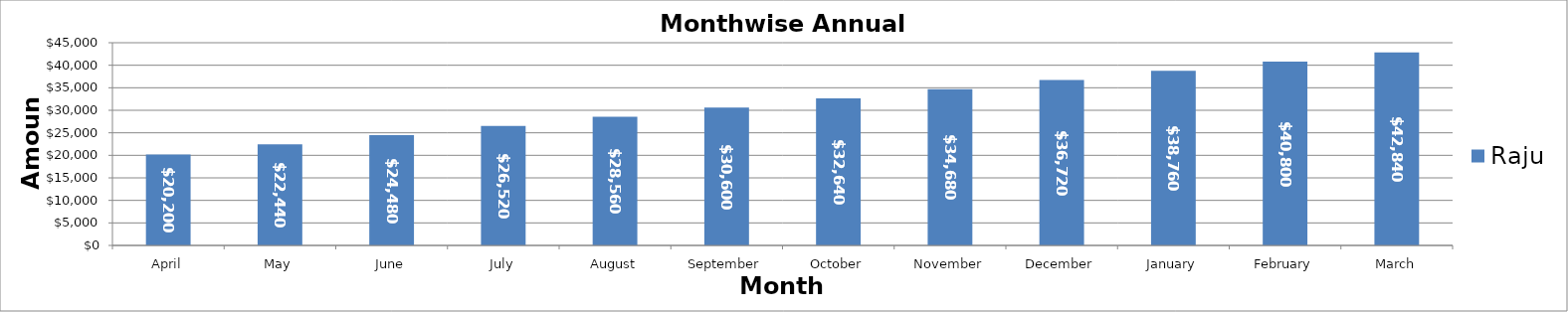
| Category | Raju |
|---|---|
| April | 20200 |
| May | 22440 |
| June | 24480 |
| July | 26520 |
| August | 28560 |
| September | 30600 |
| October | 32640 |
| November | 34680 |
| December | 36720 |
| January | 38760 |
| February | 40800 |
| March | 42840 |